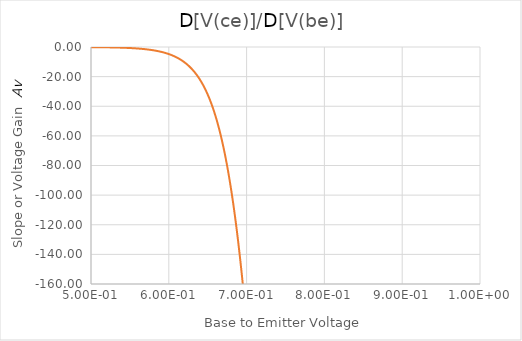
| Category | d[V(ce)]/d[V(be)] |
|---|---|
| 0.451 | -0.015 |
| 0.452 | -0.016 |
| 0.453 | -0.017 |
| 0.454 | -0.017 |
| 0.455 | -0.017 |
| 0.456 | -0.018 |
| 0.457 | -0.019 |
| 0.458 | -0.02 |
| 0.459 | -0.021 |
| 0.46 | -0.021 |
| 0.461 | -0.022 |
| 0.462 | -0.023 |
| 0.463 | -0.024 |
| 0.464 | -0.025 |
| 0.465 | -0.026 |
| 0.466 | -0.027 |
| 0.467 | -0.028 |
| 0.468 | -0.03 |
| 0.469 | -0.03 |
| 0.47 | -0.031 |
| 0.471 | -0.033 |
| 0.472 | -0.034 |
| 0.473 | -0.035 |
| 0.474 | -0.037 |
| 0.475 | -0.038 |
| 0.476 | -0.04 |
| 0.477 | -0.042 |
| 0.478 | -0.043 |
| 0.479 | -0.045 |
| 0.48 | -0.046 |
| 0.481 | -0.048 |
| 0.482 | -0.05 |
| 0.483 | -0.053 |
| 0.484 | -0.054 |
| 0.485 | -0.056 |
| 0.486 | -0.059 |
| 0.487 | -0.061 |
| 0.488 | -0.063 |
| 0.489 | -0.066 |
| 0.49 | -0.068 |
| 0.491 | -0.071 |
| 0.492 | -0.074 |
| 0.493 | -0.077 |
| 0.494 | -0.08 |
| 0.495 | -0.082 |
| 0.496 | -0.086 |
| 0.497 | -0.09 |
| 0.498 | -0.093 |
| 0.499 | -0.096 |
| 0.5 | -0.1 |
| 0.501 | -0.104 |
| 0.502 | -0.109 |
| 0.503 | -0.113 |
| 0.504 | -0.117 |
| 0.505 | -0.122 |
| 0.506 | -0.126 |
| 0.507 | -0.132 |
| 0.508 | -0.137 |
| 0.509 | -0.142 |
| 0.51 | -0.148 |
| 0.511 | -0.154 |
| 0.512 | -0.16 |
| 0.513 | -0.166 |
| 0.514 | -0.173 |
| 0.515 | -0.179 |
| 0.516 | -0.186 |
| 0.517 | -0.194 |
| 0.518 | -0.201 |
| 0.519 | -0.209 |
| 0.52 | -0.218 |
| 0.521 | -0.226 |
| 0.522 | -0.235 |
| 0.523 | -0.244 |
| 0.524 | -0.254 |
| 0.525 | -0.264 |
| 0.526 | -0.274 |
| 0.527 | -0.285 |
| 0.528 | -0.296 |
| 0.529 | -0.308 |
| 0.53 | -0.32 |
| 0.531 | -0.332 |
| 0.532 | -0.346 |
| 0.533 | -0.36 |
| 0.534 | -0.373 |
| 0.535 | -0.389 |
| 0.536 | -0.404 |
| 0.537 | -0.42 |
| 0.538 | -0.436 |
| 0.539 | -0.453 |
| 0.54 | -0.471 |
| 0.541 | -0.49 |
| 0.542 | -0.509 |
| 0.543 | -0.529 |
| 0.544 | -0.55 |
| 0.545 | -0.571 |
| 0.546 | -0.594 |
| 0.547 | -0.618 |
| 0.548 | -0.641 |
| 0.549 | -0.666 |
| 0.55 | -0.694 |
| 0.551 | -0.721 |
| 0.552 | -0.749 |
| 0.553 | -0.778 |
| 0.554 | -0.809 |
| 0.555 | -0.841 |
| 0.556 | -0.874 |
| 0.557 | -0.908 |
| 0.558 | -0.944 |
| 0.559 | -0.981 |
| 0.56 | -1.02 |
| 0.561 | -1.06 |
| 0.562 | -1.102 |
| 0.563 | -1.146 |
| 0.564 | -1.19 |
| 0.565 | -1.237 |
| 0.566 | -1.286 |
| 0.567 | -1.337 |
| 0.568 | -1.389 |
| 0.569 | -1.444 |
| 0.57 | -1.501 |
| 0.571 | -1.559 |
| 0.572 | -1.621 |
| 0.573 | -1.685 |
| 0.574 | -1.752 |
| 0.575 | -1.82 |
| 0.576 | -1.892 |
| 0.577 | -1.966 |
| 0.578 | -2.044 |
| 0.579 | -2.124 |
| 0.58 | -2.207 |
| 0.581 | -2.294 |
| 0.582 | -2.384 |
| 0.583 | -2.479 |
| 0.584 | -2.576 |
| 0.585 | -2.676 |
| 0.586 | -2.781 |
| 0.587 | -2.891 |
| 0.588 | -3.005 |
| 0.589 | -3.123 |
| 0.59 | -3.246 |
| 0.591 | -3.373 |
| 0.592 | -3.506 |
| 0.593 | -3.643 |
| 0.594 | -3.786 |
| 0.595 | -3.935 |
| 0.596 | -4.09 |
| 0.597 | -4.25 |
| 0.598 | -4.416 |
| 0.599 | -4.59 |
| 0.6 | -4.77 |
| 0.601 | -4.957 |
| 0.602 | -5.152 |
| 0.603 | -5.354 |
| 0.604 | -5.564 |
| 0.605 | -5.781 |
| 0.606 | -6.008 |
| 0.607 | -6.244 |
| 0.608 | -6.488 |
| 0.609 | -6.742 |
| 0.61 | -7.006 |
| 0.611 | -7.28 |
| 0.612 | -7.564 |
| 0.613 | -7.861 |
| 0.614 | -8.169 |
| 0.615 | -8.488 |
| 0.616 | -8.819 |
| 0.617 | -9.163 |
| 0.618 | -9.521 |
| 0.619 | -9.894 |
| 0.62 | -10.28 |
| 0.621 | -10.681 |
| 0.622 | -11.097 |
| 0.623 | -11.529 |
| 0.624 | -11.979 |
| 0.625 | -12.445 |
| 0.626 | -12.93 |
| 0.627 | -13.432 |
| 0.628 | -13.955 |
| 0.629 | -14.498 |
| 0.63 | -15.061 |
| 0.631 | -15.645 |
| 0.632 | -16.252 |
| 0.633 | -16.882 |
| 0.634 | -17.537 |
| 0.635 | -18.216 |
| 0.636 | -18.921 |
| 0.637 | -19.652 |
| 0.638 | -20.412 |
| 0.639 | -21.2 |
| 0.64 | -22.018 |
| 0.641 | -22.867 |
| 0.642 | -23.747 |
| 0.643 | -24.662 |
| 0.644 | -25.61 |
| 0.645 | -26.594 |
| 0.646 | -27.614 |
| 0.647 | -28.672 |
| 0.648 | -29.771 |
| 0.649 | -30.908 |
| 0.65 | -32.089 |
| 0.651 | -33.314 |
| 0.652 | -34.584 |
| 0.653 | -35.9 |
| 0.654 | -37.265 |
| 0.655 | -38.679 |
| 0.656 | -40.144 |
| 0.657 | -41.663 |
| 0.658 | -43.237 |
| 0.659 | -44.868 |
| 0.66 | -46.558 |
| 0.661 | -48.308 |
| 0.662 | -50.121 |
| 0.663 | -51.997 |
| 0.664 | -53.94 |
| 0.665 | -55.952 |
| 0.666 | -58.034 |
| 0.667 | -60.19 |
| 0.668 | -62.419 |
| 0.669 | -64.726 |
| 0.67 | -67.113 |
| 0.671 | -69.581 |
| 0.672 | -72.133 |
| 0.673 | -74.771 |
| 0.674 | -77.498 |
| 0.675 | -80.316 |
| 0.676 | -83.228 |
| 0.677 | -86.234 |
| 0.678 | -89.34 |
| 0.679 | -92.547 |
| 0.68 | -95.856 |
| 0.681 | -99.271 |
| 0.682 | -102.794 |
| 0.683 | -106.429 |
| 0.684 | -110.175 |
| 0.685 | -114.037 |
| 0.686 | -118.016 |
| 0.687 | -122.115 |
| 0.688 | -126.337 |
| 0.689 | -130.683 |
| 0.69 | -135.154 |
| 0.691 | -139.756 |
| 0.692 | -144.486 |
| 0.693 | -149.35 |
| 0.694 | -154.347 |
| 0.695 | -159.475 |
| 0.696 | -162.011 |